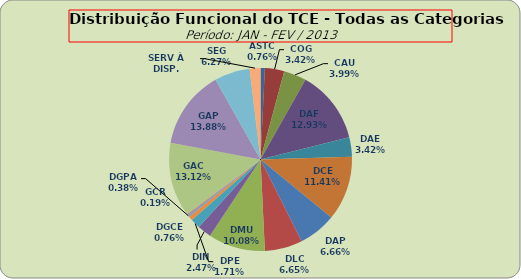
| Category | Series 0 |
|---|---|
| ASTC | 4 |
| COG | 18 |
| CAU | 21 |
| DAF | 68 |
| DAE | 18 |
| DCE | 60 |
| DAP | 35 |
| DLC | 35 |
| DMU | 53 |
| DIN | 13 |
| DPE | 9 |
| DGCE | 4 |
| DGPA | 2 |
| GCR | 1 |
| GAC | 69 |
| GAP | 73 |
| SEG | 33 |
| SERV À DISP. | 10 |